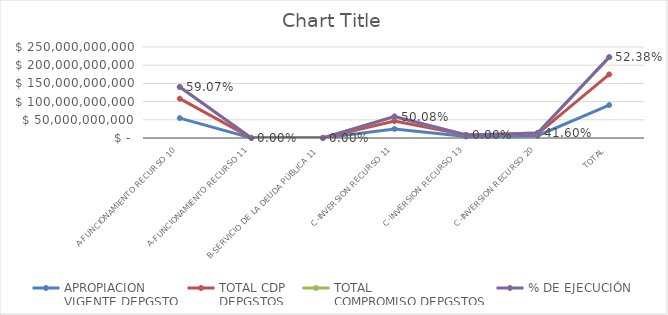
| Category | APROPIACION
VIGENTE DEPGSTO | TOTAL CDP
DEPGSTOS | TOTAL
COMPROMISO DEPGSTOS | % DE EJECUCIÓN |
|---|---|---|---|---|
| A-FUNCIONAMIENTO RECURSO 10 | 54721000000 | 53287765501.7 | 32322893385.32 | 0.591 |
| A-FUNCIONAMIENTO RECURSO 11 | 231000000 | 0 | 0 | 0 |
| B-SERVICIO DE LA DEUDA PÚBLICA 11 | 131748779 | 0 | 0 | 0 |
| C-INVERSION RECURSO 11 | 24983074635 | 21534332963 | 12511209055.95 | 0.501 |
| C-INVERSION RECURSO 13 | 4242000000 | 4242000000 | 0 | 0 |
| C-INVERSION RECURSO 20 | 6251000000 | 5063800369 | 2600578367 | 0.416 |
| TOTAL | 90559823414 | 84127898833.7 | 47434680808.27 | 0.524 |